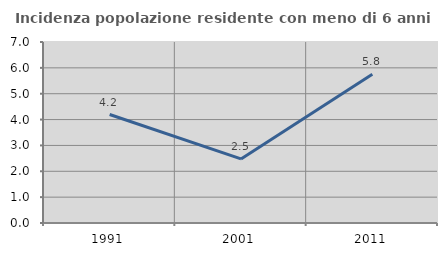
| Category | Incidenza popolazione residente con meno di 6 anni |
|---|---|
| 1991.0 | 4.196 |
| 2001.0 | 2.479 |
| 2011.0 | 5.755 |